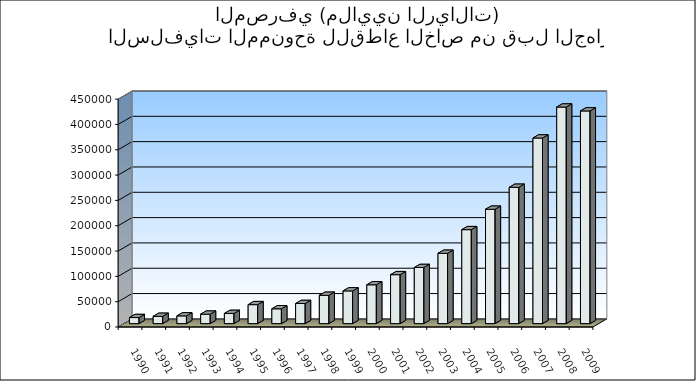
| Category | الإجمالي |
|---|---|
| 1990.0 | 11998.7 |
| 1991.0 | 14410.3 |
| 1992.0 | 15274.5 |
| 1993.0 | 18675.4 |
| 1994.0 | 20140.4 |
| 1995.0 | 37460 |
| 1996.0 | 29302.9 |
| 1997.0 | 39732 |
| 1998.0 | 55934.7 |
| 1999.0 | 64618.2 |
| 2000.0 | 76695.2 |
| 2001.0 | 96665.4 |
| 2002.0 | 110810.6 |
| 2003.0 | 138855.9 |
| 2004.0 | 185553.8 |
| 2005.0 | 225826.5 |
| 2006.0 | 269181.5 |
| 2007.0 | 366549.6 |
| 2008.0 | 427677.1 |
| 2009.0 | 420015.8 |